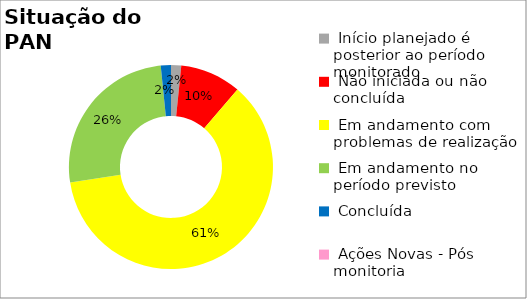
| Category | Series 0 |
|---|---|
|  Início planejado é posterior ao período monitorado | 0.016 |
|  Não iniciada ou não concluída | 0.097 |
|  Em andamento com problemas de realização | 0.613 |
|  Em andamento no período previsto  | 0.258 |
|  Concluída | 0.016 |
|  Ações Novas - Pós monitoria | 0 |